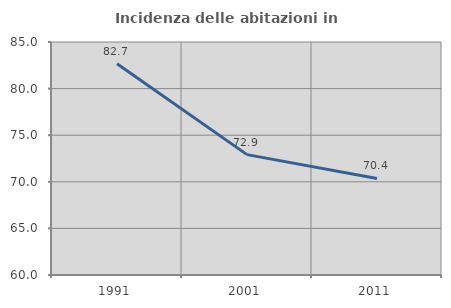
| Category | Incidenza delle abitazioni in proprietà  |
|---|---|
| 1991.0 | 82.675 |
| 2001.0 | 72.917 |
| 2011.0 | 70.365 |